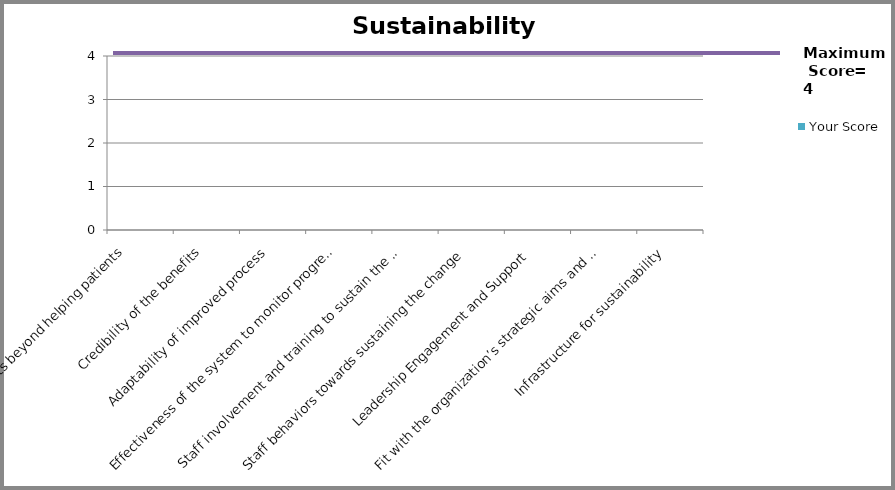
| Category | Your Score |
|---|---|
| Benefits beyond helping patients 
 | 0 |
| Credibility of the benefits | 0 |
| Adaptability of improved process | 0 |
| Effectiveness of the system to monitor progress | 0 |
| Staff involvement and training to sustain the process | 0 |
| Staff behaviors towards sustaining the change | 0 |
| Leadership Engagement and Support | 0 |
| Fit with the organization’s strategic aims and culture | 0 |
| Infrastructure for sustainability | 0 |